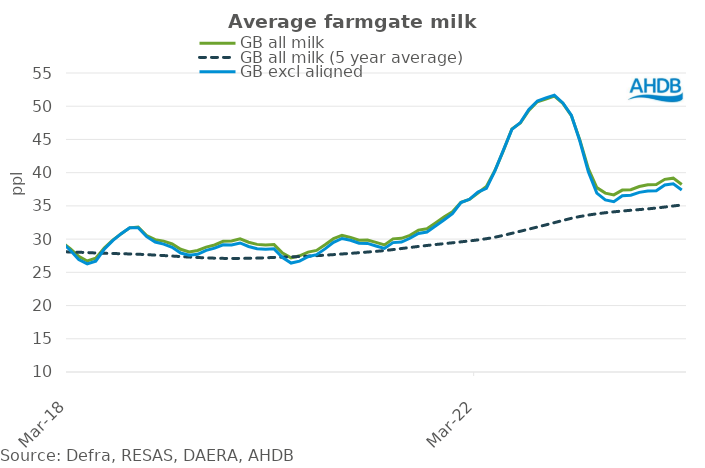
| Category | GB all milk | GB all milk (5 year average) | GB excl aligned |
|---|---|---|---|
| 2010-04-01 | 23.396 | 22.051 | 22.994 |
| 2010-05-01 | 23.39 | 22.152 | 23.011 |
| 2010-06-01 | 23.603 | 22.254 | 23.189 |
| 2010-07-01 | 24.227 | 22.353 | 23.855 |
| 2010-08-01 | 24.736 | 22.454 | 24.398 |
| 2010-09-01 | 25.272 | 22.551 | 24.921 |
| 2010-10-01 | 25.779 | 22.652 | 25.391 |
| 2010-11-01 | 25.935 | 22.755 | 25.538 |
| 2010-12-01 | 25.907 | 22.866 | 25.46 |
| 2011-01-01 | 25.732 | 22.983 | 25.231 |
| 2011-02-01 | 25.868 | 23.106 | 25.384 |
| 2011-03-01 | 26.324 | 23.239 | 25.883 |
| 2011-04-01 | 26.5 | 23.387 | 26.121 |
| 2011-05-01 | 26.503 | 23.545 | 26.137 |
| 2011-06-01 | 26.712 | 23.705 | 26.333 |
| 2011-07-01 | 27.27 | 23.868 | 26.911 |
| 2011-08-01 | 27.526 | 24.03 | 27.106 |
| 2011-09-01 | 28.07 | 24.188 | 27.683 |
| 2011-10-01 | 29.167 | 24.358 | 28.784 |
| 2011-11-01 | 29.551 | 24.532 | 29.216 |
| 2011-12-01 | 29.441 | 24.712 | 29.134 |
| 2012-01-01 | 29.16 | 24.896 | 28.845 |
| 2012-02-01 | 29.17 | 25.083 | 28.826 |
| 2012-03-01 | 28.975 | 25.269 | 28.627 |
| 2012-04-01 | 28.362 | 25.447 | 28.085 |
| 2012-05-01 | 27.904 | 25.621 | 27.598 |
| 2012-06-01 | 26.906 | 25.772 | 26.398 |
| 2012-07-01 | 27.033 | 25.901 | 26.461 |
| 2012-08-01 | 27.01 | 26.016 | 26.428 |
| 2012-09-01 | 27.739 | 26.105 | 27.154 |
| 2012-10-01 | 29.17 | 26.158 | 28.627 |
| 2012-11-01 | 29.857 | 26.207 | 29.453 |
| 2012-12-01 | 30.165 | 26.27 | 29.875 |
| 2013-01-01 | 30.265 | 26.345 | 29.828 |
| 2013-02-01 | 30.434 | 26.422 | 29.991 |
| 2013-03-01 | 30.422 | 26.495 | 29.991 |
| 2013-04-01 | 30.05 | 26.572 | 29.654 |
| 2013-05-01 | 29.842 | 26.652 | 29.474 |
| 2013-06-01 | 30.642 | 26.737 | 30.38 |
| 2013-07-01 | 31.426 | 26.821 | 31.122 |
| 2013-08-01 | 31.866 | 26.907 | 31.473 |
| 2013-09-01 | 32.827 | 26.997 | 32.539 |
| 2013-10-01 | 33.528 | 27.091 | 33.229 |
| 2013-11-01 | 34.494 | 27.199 | 34.342 |
| 2013-12-01 | 34.2 | 27.31 | 34.205 |
| 2014-01-01 | 33.867 | 27.427 | 33.805 |
| 2014-02-01 | 33.993 | 27.564 | 33.942 |
| 2014-03-01 | 33.707 | 27.701 | 33.718 |
| 2014-04-01 | 33.36 | 27.854 | 33.337 |
| 2014-05-01 | 32.543 | 28.045 | 32.516 |
| 2014-06-01 | 32.109 | 28.193 | 31.953 |
| 2014-07-01 | 32.151 | 28.33 | 31.805 |
| 2014-08-01 | 31.795 | 28.46 | 31.35 |
| 2014-09-01 | 31.501 | 28.575 | 30.967 |
| 2014-10-01 | 30.487 | 28.672 | 29.83 |
| 2014-11-01 | 29.66 | 28.754 | 29.115 |
| 2014-12-01 | 28.556 | 28.82 | 27.961 |
| 2015-01-01 | 27.203 | 28.865 | 26.316 |
| 2015-02-01 | 26.682 | 28.903 | 25.672 |
| 2015-03-01 | 25.51 | 28.925 | 24.417 |
| 2015-04-01 | 25.209 | 28.955 | 24.186 |
| 2015-05-01 | 24.778 | 28.978 | 23.868 |
| 2015-06-01 | 24.575 | 28.994 | 23.481 |
| 2015-07-01 | 24.53 | 28.999 | 23.305 |
| 2015-08-01 | 24.234 | 28.991 | 22.855 |
| 2015-09-01 | 24.529 | 28.979 | 23.184 |
| 2015-10-01 | 25.108 | 28.967 | 23.795 |
| 2015-11-01 | 24.696 | 28.947 | 23.448 |
| 2015-12-01 | 24.682 | 28.926 | 23.513 |
| 2016-01-01 | 24.002 | 28.897 | 22.712 |
| 2016-02-01 | 23.859 | 28.864 | 22.542 |
| 2016-03-01 | 23.244 | 28.813 | 21.853 |
| 2016-04-01 | 22.31 | 28.743 | 20.652 |
| 2016-05-01 | 20.982 | 28.651 | 19.436 |
| 2016-06-01 | 20.489 | 28.547 | 18.856 |
| 2016-07-01 | 21.235 | 28.446 | 19.691 |
| 2016-08-01 | 21.738 | 28.35 | 20.334 |
| 2016-09-01 | 22.941 | 28.264 | 21.722 |
| 2016-10-01 | 24.144 | 28.181 | 23.227 |
| 2016-11-01 | 25.371 | 28.111 | 24.679 |
| 2016-12-01 | 26.061 | 28.055 | 25.6 |
| 2017-01-01 | 27.097 | 28.02 | 26.901 |
| 2017-02-01 | 27.737 | 27.997 | 27.614 |
| 2017-03-01 | 27.694 | 27.975 | 27.563 |
| 2017-04-01 | 27.084 | 27.954 | 26.845 |
| 2017-05-01 | 26.835 | 27.936 | 26.461 |
| 2017-06-01 | 26.681 | 27.932 | 26.258 |
| 2017-07-01 | 27.782 | 27.945 | 27.45 |
| 2017-08-01 | 28.862 | 27.976 | 28.635 |
| 2017-09-01 | 30.311 | 28.019 | 30.258 |
| 2017-10-01 | 31.638 | 28.06 | 31.793 |
| 2017-11-01 | 31.712 | 28.091 | 31.907 |
| 2017-12-01 | 31.427 | 28.112 | 31.602 |
| 2018-01-01 | 30.431 | 28.114 | 30.501 |
| 2018-02-01 | 29.524 | 28.099 | 29.498 |
| 2018-03-01 | 28.564 | 28.068 | 28.331 |
| 2018-04-01 | 27.392 | 28.024 | 26.927 |
| 2018-05-01 | 26.712 | 27.972 | 26.266 |
| 2018-06-01 | 27.115 | 27.913 | 26.678 |
| 2018-07-01 | 28.641 | 27.867 | 28.469 |
| 2018-08-01 | 29.857 | 27.833 | 29.772 |
| 2018-09-01 | 30.804 | 27.799 | 30.821 |
| 2018-10-01 | 31.69 | 27.769 | 31.703 |
| 2018-11-01 | 31.821 | 27.724 | 31.71 |
| 2018-12-01 | 30.542 | 27.663 | 30.367 |
| 2019-01-01 | 29.915 | 27.597 | 29.554 |
| 2019-02-01 | 29.696 | 27.526 | 29.245 |
| 2019-03-01 | 29.266 | 27.452 | 28.774 |
| 2019-04-01 | 28.466 | 27.37 | 27.907 |
| 2019-05-01 | 28.077 | 27.296 | 27.57 |
| 2019-06-01 | 28.291 | 27.232 | 27.717 |
| 2019-07-01 | 28.799 | 27.176 | 28.311 |
| 2019-08-01 | 29.117 | 27.132 | 28.637 |
| 2019-09-01 | 29.663 | 27.101 | 29.142 |
| 2019-10-01 | 29.712 | 27.088 | 29.127 |
| 2019-11-01 | 30.037 | 27.094 | 29.417 |
| 2019-12-01 | 29.526 | 27.11 | 28.891 |
| 2020-01-01 | 29.206 | 27.144 | 28.562 |
| 2020-02-01 | 29.122 | 27.185 | 28.477 |
| 2020-03-01 | 29.171 | 27.246 | 28.532 |
| 2020-04-01 | 27.906 | 27.291 | 27.235 |
| 2020-05-01 | 27.178 | 27.331 | 26.394 |
| 2020-06-01 | 27.492 | 27.379 | 26.688 |
| 2020-07-01 | 28.042 | 27.438 | 27.34 |
| 2020-08-01 | 28.304 | 27.506 | 27.666 |
| 2020-09-01 | 29.157 | 27.583 | 28.527 |
| 2020-10-01 | 30.064 | 27.665 | 29.503 |
| 2020-11-01 | 30.554 | 27.763 | 30.095 |
| 2020-12-01 | 30.267 | 27.856 | 29.826 |
| 2021-01-01 | 29.845 | 27.953 | 29.38 |
| 2021-02-01 | 29.876 | 28.054 | 29.355 |
| 2021-03-01 | 29.511 | 28.158 | 28.966 |
| 2021-04-01 | 29.136 | 28.272 | 28.592 |
| 2021-05-01 | 30.036 | 28.423 | 29.471 |
| 2021-06-01 | 30.116 | 28.583 | 29.562 |
| 2021-07-01 | 30.569 | 28.739 | 30.128 |
| 2021-08-01 | 31.352 | 28.899 | 30.852 |
| 2021-09-01 | 31.565 | 29.043 | 31.076 |
| 2021-10-01 | 32.43 | 29.181 | 31.987 |
| 2021-11-01 | 33.315 | 29.313 | 32.876 |
| 2021-12-01 | 34.109 | 29.447 | 33.822 |
| 2022-01-01 | 35.526 | 29.588 | 35.507 |
| 2022-02-01 | 35.966 | 29.725 | 35.994 |
| 2022-03-01 | 36.944 | 29.879 | 37.088 |
| 2022-04-01 | 37.909 | 30.06 | 37.626 |
| 2022-05-01 | 40.322 | 30.284 | 40.268 |
| 2022-06-01 | 43.314 | 30.562 | 43.385 |
| 2022-07-01 | 46.572 | 30.875 | 46.505 |
| 2022-08-01 | 47.479 | 31.185 | 47.538 |
| 2022-09-01 | 49.378 | 31.503 | 49.517 |
| 2022-10-01 | 50.668 | 31.82 | 50.782 |
| 2022-11-01 | 51.094 | 32.143 | 51.25 |
| 2022-12-01 | 51.513 | 32.478 | 51.651 |
| 2023-01-01 | 50.442 | 32.811 | 50.49 |
| 2023-02-01 | 48.593 | 33.129 | 48.645 |
| 2023-03-01 | 44.94 | 33.402 | 44.759 |
| 2023-04-01 | 40.603 | 33.622 | 40.136 |
| 2023-05-01 | 37.748 | 33.806 | 36.929 |
| 2023-06-01 | 36.923 | 33.97 | 35.9 |
| 2023-07-01 | 36.662 | 34.103 | 35.632 |
| 2023-08-01 | 37.38 | 34.229 | 36.534 |
| 2023-09-01 | 37.427 | 34.339 | 36.607 |
| 2023-10-01 | 37.916 | 34.443 | 37.033 |
| 2023-11-01 | 38.18 | 34.549 | 37.229 |
| 2023-12-01 | 38.225 | 34.677 | 37.287 |
| 2024-01-01 | 38.996 | 34.828 | 38.155 |
| 2024-02-01 | 39.174 | 34.986 | 38.329 |
| 2024-03-01 | 38.23 | 35.136 | 37.401 |